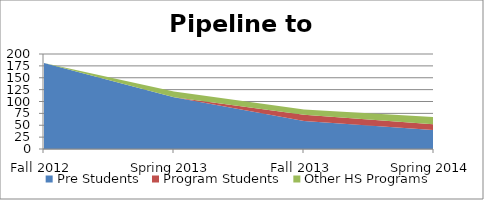
| Category | Pre Students | Program Students | Other HS Programs |
|---|---|---|---|
| Fall 2012 | 181 | 0 | 0 |
| Spring 2013 | 109 | 0 | 12 |
| Fall 2013 | 59 | 13 | 11 |
| Spring 2014 | 40 | 12 | 15 |